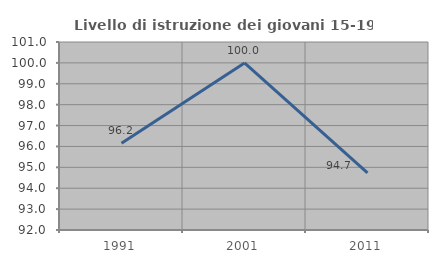
| Category | Livello di istruzione dei giovani 15-19 anni |
|---|---|
| 1991.0 | 96.154 |
| 2001.0 | 100 |
| 2011.0 | 94.737 |